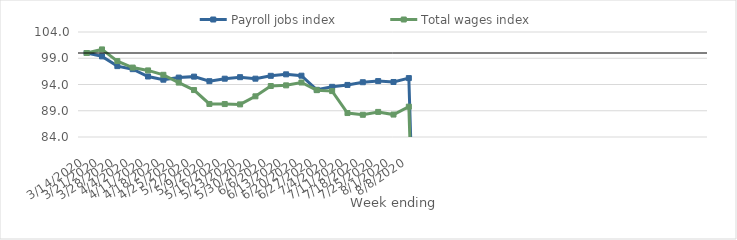
| Category | Payroll jobs index | Total wages index |
|---|---|---|
| 14/03/2020 | 100 | 100 |
| 21/03/2020 | 99.357 | 100.683 |
| 28/03/2020 | 97.501 | 98.462 |
| 04/04/2020 | 96.922 | 97.224 |
| 11/04/2020 | 95.527 | 96.684 |
| 18/04/2020 | 94.915 | 95.846 |
| 25/04/2020 | 95.317 | 94.365 |
| 02/05/2020 | 95.498 | 92.943 |
| 09/05/2020 | 94.628 | 90.293 |
| 16/05/2020 | 95.107 | 90.275 |
| 23/05/2020 | 95.393 | 90.211 |
| 30/05/2020 | 95.108 | 91.747 |
| 06/06/2020 | 95.652 | 93.713 |
| 13/06/2020 | 95.935 | 93.838 |
| 20/06/2020 | 95.676 | 94.381 |
| 27/06/2020 | 92.984 | 92.921 |
| 04/07/2020 | 93.556 | 92.746 |
| 11/07/2020 | 93.919 | 88.563 |
| 18/07/2020 | 94.432 | 88.231 |
| 25/07/2020 | 94.649 | 88.778 |
| 01/08/2020 | 94.477 | 88.272 |
| 08/08/2020 | 95.221 | 89.779 |